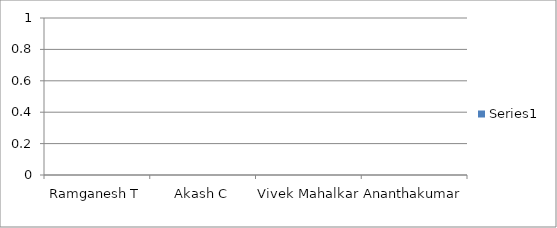
| Category | Series 0 |
|---|---|
| Ramganesh T | 0 |
| Akash C | 0 |
| Vivek Mahalkar | 0 |
| Ananthakumar | 0 |